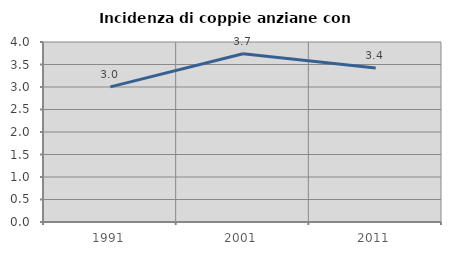
| Category | Incidenza di coppie anziane con figli |
|---|---|
| 1991.0 | 3.002 |
| 2001.0 | 3.738 |
| 2011.0 | 3.423 |